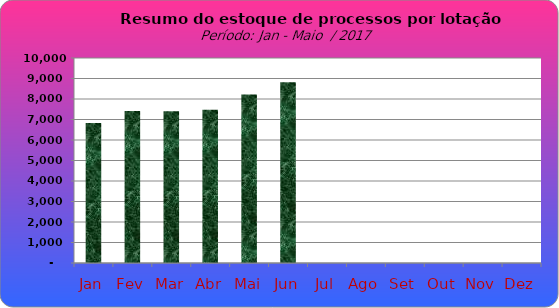
| Category | Series 0 |
|---|---|
| Jan | 6829 |
| Fev | 7414 |
| Mar | 7401 |
| Abr | 7477 |
| Mai | 8225 |
| Jun | 8821 |
| Jul | 0 |
| Ago | 0 |
| Set | 0 |
| Out | 0 |
| Nov | 0 |
| Dez | 0 |